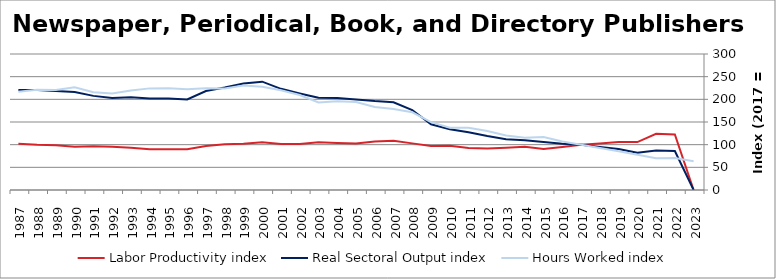
| Category | Labor Productivity index | Real Sectoral Output index | Hours Worked index |
|---|---|---|---|
| 2023.0 | 0 | 0 | 63.56 |
| 2022.0 | 122.417 | 86.104 | 70.337 |
| 2021.0 | 123.961 | 87.116 | 70.276 |
| 2020.0 | 105.734 | 82.343 | 77.877 |
| 2019.0 | 105.946 | 90.378 | 85.305 |
| 2018.0 | 102.582 | 94.916 | 92.528 |
| 2017.0 | 100 | 100 | 100 |
| 2016.0 | 94.93 | 101.761 | 107.195 |
| 2015.0 | 90.562 | 105.925 | 116.965 |
| 2014.0 | 95.163 | 109.933 | 115.521 |
| 2013.0 | 93.162 | 112.071 | 120.297 |
| 2012.0 | 91.514 | 119.035 | 130.073 |
| 2011.0 | 92.604 | 127.298 | 137.464 |
| 2010.0 | 97.592 | 133.846 | 137.149 |
| 2009.0 | 96.876 | 145.052 | 149.729 |
| 2008.0 | 102.861 | 176.334 | 171.429 |
| 2007.0 | 108.39 | 193.597 | 178.612 |
| 2006.0 | 107.193 | 196.095 | 182.935 |
| 2005.0 | 102.838 | 199.519 | 194.014 |
| 2004.0 | 103.739 | 202.903 | 195.59 |
| 2003.0 | 105.418 | 203.366 | 192.913 |
| 2002.0 | 101.685 | 213.017 | 209.487 |
| 2001.0 | 101.449 | 223.173 | 219.985 |
| 2000.0 | 105.059 | 239.007 | 227.498 |
| 1999.0 | 101.918 | 234.988 | 230.566 |
| 1998.0 | 100.944 | 226.131 | 224.017 |
| 1997.0 | 97.3 | 218.406 | 224.467 |
| 1996.0 | 89.939 | 199.902 | 222.264 |
| 1995.0 | 90.001 | 201.936 | 224.371 |
| 1994.0 | 90.154 | 202.094 | 224.165 |
| 1993.0 | 93.082 | 204.506 | 219.705 |
| 1992.0 | 95.304 | 202.958 | 212.958 |
| 1991.0 | 96.237 | 207.64 | 215.759 |
| 1990.0 | 95.32 | 216.039 | 226.645 |
| 1989.0 | 98.957 | 218.404 | 220.706 |
| 1988.0 | 99.894 | 220.703 | 220.937 |
| 1987.0 | 101.846 | 220.552 | 216.555 |